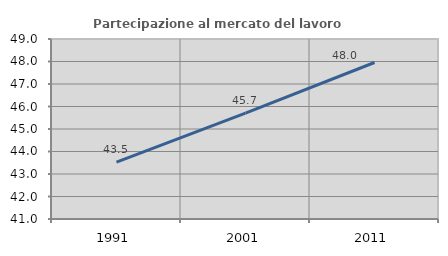
| Category | Partecipazione al mercato del lavoro  femminile |
|---|---|
| 1991.0 | 43.524 |
| 2001.0 | 45.707 |
| 2011.0 | 47.955 |